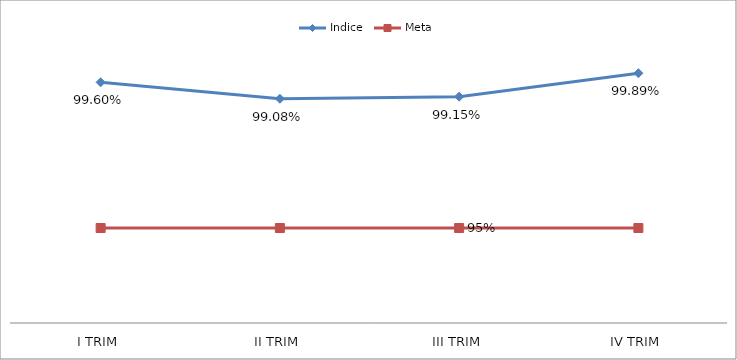
| Category | Indice | Meta |
|---|---|---|
| I TRIM | 0.996 | 0.95 |
| II TRIM | 0.991 | 0.95 |
| III TRIM | 0.991 | 0.95 |
| IV TRIM | 0.999 | 0.95 |